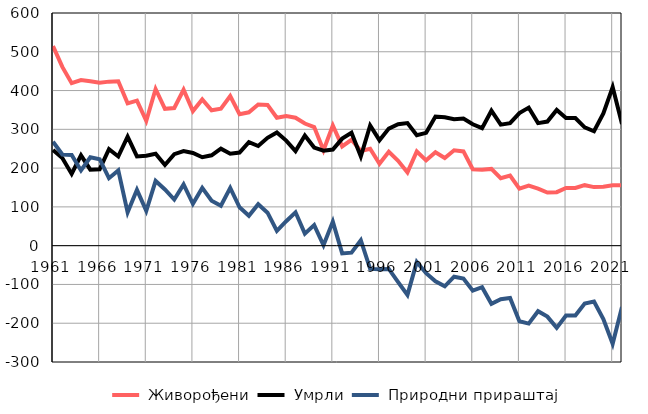
| Category |  Живорођени |  Умрли |  Природни прираштај |
|---|---|---|---|
| 1961.0 | 515 | 247 | 268 |
| 1962.0 | 461 | 226 | 235 |
| 1963.0 | 419 | 185 | 234 |
| 1964.0 | 427 | 233 | 194 |
| 1965.0 | 424 | 196 | 228 |
| 1966.0 | 420 | 197 | 223 |
| 1967.0 | 423 | 249 | 174 |
| 1968.0 | 424 | 230 | 194 |
| 1969.0 | 367 | 281 | 86 |
| 1970.0 | 374 | 230 | 144 |
| 1971.0 | 322 | 232 | 90 |
| 1972.0 | 404 | 237 | 167 |
| 1973.0 | 353 | 208 | 145 |
| 1974.0 | 355 | 236 | 119 |
| 1975.0 | 402 | 244 | 158 |
| 1976.0 | 347 | 239 | 108 |
| 1977.0 | 377 | 228 | 149 |
| 1978.0 | 349 | 233 | 116 |
| 1979.0 | 353 | 250 | 103 |
| 1980.0 | 386 | 237 | 149 |
| 1981.0 | 339 | 240 | 99 |
| 1982.0 | 344 | 267 | 77 |
| 1983.0 | 364 | 257 | 107 |
| 1984.0 | 363 | 278 | 85 |
| 1985.0 | 330 | 292 | 38 |
| 1986.0 | 334 | 271 | 63 |
| 1987.0 | 330 | 244 | 86 |
| 1988.0 | 315 | 284 | 31 |
| 1989.0 | 306 | 253 | 53 |
| 1990.0 | 246 | 245 | 1 |
| 1991.0 | 310 | 248 | 62 |
| 1992.0 | 256 | 276 | -20 |
| 1993.0 | 273 | 291 | -18 |
| 1994.0 | 244 | 230 | 14 |
| 1995.0 | 250 | 310 | -60 |
| 1996.0 | 211 | 272 | -61 |
| 1997.0 | 242 | 302 | -60 |
| 1998.0 | 219 | 313 | -94 |
| 1999.0 | 189 | 316 | -127 |
| 2000.0 | 243 | 285 | -42 |
| 2001.0 | 220 | 291 | -71 |
| 2002.0 | 241 | 333 | -92 |
| 2003.0 | 226 | 331 | -105 |
| 2004.0 | 246 | 326 | -80 |
| 2005.0 | 243 | 328 | -85 |
| 2006.0 | 197 | 313 | -116 |
| 2007.0 | 196 | 303 | -107 |
| 2008.0 | 198 | 348 | -150 |
| 2009.0 | 174 | 312 | -138 |
| 2010.0 | 181 | 316 | -135 |
| 2011.0 | 147 | 342 | -195 |
| 2012.0 | 155 | 356 | -201 |
| 2013.0 | 147 | 316 | -169 |
| 2014.0 | 137 | 320 | -183 |
| 2015.0 | 138 | 350 | -212 |
| 2016.0 | 149 | 329 | -180 |
| 2017.0 | 149 | 329 | -180 |
| 2018.0 | 156 | 305 | -149 |
| 2019.0 | 151 | 295 | -144 |
| 2020.0 | 152 | 341 | -189 |
| 2021.0 | 156 | 409 | -253 |
| 2022.0 | 156 | 314 | -158 |